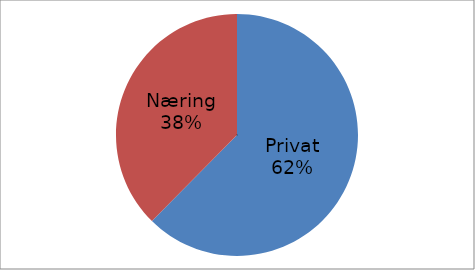
| Category | Series 0 |
|---|---|
| Privat | 34817978 |
| Næring | 20972037 |